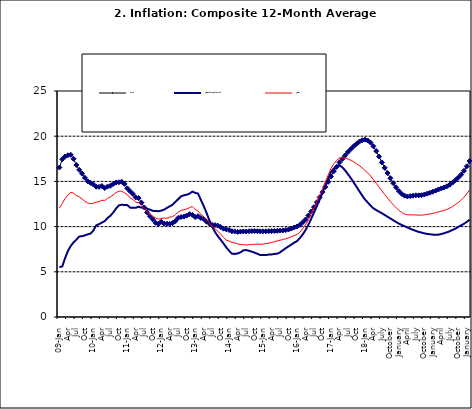
| Category | Food | All Items less Farm Produce | All Items |
|---|---|---|---|
| 09-Jan | 16.536 | 5.519 | 12.032 |
| Feb | 17.454 | 5.591 | 12.567 |
| Mar | 17.742 | 6.51 | 13.101 |
| Apr | 17.89 | 7.302 | 13.51 |
| May | 17.949 | 7.847 | 13.787 |
| June | 17.498 | 8.259 | 13.694 |
| Jul | 16.808 | 8.554 | 13.437 |
| Aug | 16.278 | 8.906 | 13.307 |
| Sep | 15.859 | 8.942 | 13.065 |
| Oct | 15.396 | 9.024 | 12.803 |
| Nov | 15.018 | 9.143 | 12.609 |
| Dec | 14.841 | 9.226 | 12.538 |
| 10-Jan | 14.668 | 9.567 | 12.586 |
| Feb | 14.411 | 10.138 | 12.7 |
| Mar | 14.395 | 10.269 | 12.757 |
| Apr | 14.489 | 10.444 | 12.915 |
| May | 14.266 | 10.597 | 12.893 |
| Jun | 14.424 | 10.948 | 13.132 |
| Jul | 14.514 | 11.193 | 13.284 |
| Aug | 14.706 | 11.549 | 13.5 |
| Sep | 14.872 | 11.997 | 13.764 |
| Oct | 14.906 | 12.345 | 13.908 |
| Nov | 14.967 | 12.423 | 13.928 |
| Dec | 14.723 | 12.383 | 13.74 |
| 11-Jan | 14.233 | 12.385 | 13.542 |
| Feb | 13.903 | 12.099 | 13.161 |
| Mar | 13.606 | 12.077 | 13.001 |
| Apr | 13.227 | 12.088 | 12.694 |
| May | 13.152 | 12.198 | 12.648 |
| Jun | 12.654 | 12.1 | 12.321 |
| Jul | 12.118 | 12.109 | 12.009 |
| Aug | 11.575 | 11.98 | 11.635 |
| Sep | 11.155 | 11.877 | 11.363 |
| Oct | 10.797 | 11.746 | 11.13 |
| Nov | 10.422 | 11.721 | 10.952 |
| Dec | 10.298 | 11.706 | 10.826 |
| 12-Jan | 10.538 | 11.765 | 10.886 |
| 12-Feb | 10.336 | 11.872 | 10.955 |
| 12-Mar | 10.325 | 12.075 | 10.914 |
| Apr | 10.304 | 12.242 | 11.054 |
| May | 10.387 | 12.419 | 11.096 |
| Jun | 10.617 | 12.732 | 11.32 |
| Jul | 10.963 | 13.032 | 11.599 |
| Aug | 11.056 | 13.349 | 11.791 |
| Sep | 11.104 | 13.467 | 11.859 |
| Oct | 11.216 | 13.525 | 11.948 |
| Nov | 11.372 | 13.649 | 12.091 |
| Dec | 11.296 | 13.873 | 12.224 |
| 13-Jan | 11.055 | 13.737 | 11.908 |
| Feb | 11.153 | 13.657 | 11.703 |
| Mar | 10.951 | 12.963 | 11.394 |
| Apr | 10.844 | 12.281 | 11.072 |
| May | 10.548 | 11.531 | 10.761 |
| Jun | 10.352 | 10.704 | 10.383 |
| Jul | 10.186 | 10.005 | 10.047 |
| Aug | 10.168 | 9.4 | 9.761 |
| Sep | 10.105 | 8.939 | 9.486 |
| Oct | 9.955 | 8.553 | 9.167 |
| Nov | 9.774 | 8.136 | 8.815 |
| Dec | 9.695 | 7.691 | 8.496 |
| 14-Jan | 9.626 | 7.317 | 8.408 |
| Feb | 9.484 | 7.005 | 8.257 |
| Mar | 9.464 | 6.976 | 8.19 |
| Apr | 9.416 | 7.03 | 8.092 |
| May | 9.448 | 7.151 | 8.012 |
| Jun | 9.464 | 7.369 | 7.998 |
| Jul | 9.459 | 7.411 | 7.968 |
| Aug | 9.481 | 7.325 | 7.996 |
| Sep | 9.501 | 7.228 | 8.027 |
| Oct | 9.508 | 7.116 | 8.047 |
| Nov | 9.492 | 6.991 | 8.046 |
| Dec | 9.481 | 6.854 | 8.047 |
| 15-Jan | 9.475 | 6.865 | 8.063 |
| Feb | 9.486 | 6.852 | 8.117 |
| Mar | 9.495 | 6.905 | 8.176 |
| Apr | 9.501 | 6.922 | 8.243 |
| May | 9.51 | 6.975 | 8.331 |
| Jun | 9.535 | 7.006 | 8.417 |
| Jul | 9.552 | 7.154 | 8.497 |
| Aug | 9.571 | 7.384 | 8.566 |
| Sep | 9.614 | 7.605 | 8.658 |
| Oct | 9.68 | 7.812 | 8.76 |
| Nov | 9.778 | 8.016 | 8.879 |
| Dec | 9.898 | 8.222 | 9.009 |
| 16-Jan | 10.017 | 8.391 | 9.13 |
| Feb | 10.184 | 8.732 | 9.386 |
| Mar | 10.471 | 9.132 | 9.751 |
| Apr | 10.786 | 9.614 | 10.182 |
| May | 11.221 | 10.196 | 10.746 |
| Jun | 11.672 | 10.864 | 11.372 |
| Jul | 12.162 | 11.553 | 12.045 |
| Aug | 12.696 | 12.247 | 12.744 |
| Sep | 13.238 | 12.98 | 13.454 |
| Oct | 13.817 | 13.757 | 14.206 |
| Nov | 14.386 | 14.542 | 14.958 |
| Dec | 14.946 | 15.307 | 15.697 |
| 17-Jan | 15.536 | 16.042 | 16.441 |
| Feb | 16.127 | 16.436 | 16.958 |
| Mar | 16.598 | 16.682 | 17.315 |
| Apr | 17.106 | 16.772 | 17.591 |
| May | 17.477 | 16.567 | 17.628 |
| Jun | 17.868 | 16.219 | 17.578 |
| Jul | 18.247 | 15.798 | 17.475 |
| Aug | 18.569 | 15.372 | 17.331 |
| Sep | 18.876 | 14.903 | 17.17 |
| Oct | 19.14 | 14.415 | 16.968 |
| Nov | 19.392 | 13.93 | 16.76 |
| Dec | 19.546 | 13.458 | 16.502 |
| 18-Jan | 19.621 | 13.01 | 16.215 |
| Feb | 19.521 | 12.668 | 15.93 |
| Mar | 19.294 | 12.33 | 15.599 |
| Apr | 18.886 | 12.021 | 15.196 |
| May | 18.359 | 11.828 | 14.793 |
| June | 17.745 | 11.651 | 14.371 |
| July | 17.102 | 11.478 | 13.95 |
| August | 16.501 | 11.285 | 13.546 |
| September | 15.923 | 11.092 | 13.157 |
| October | 15.355 | 10.903 | 12.777 |
| November | 14.802 | 10.703 | 12.406 |
| December | 14.348 | 10.514 | 12.095 |
| January | 13.934 | 10.339 | 11.801 |
| February | 13.62 | 10.185 | 11.564 |
| March | 13.42 | 10.044 | 11.401 |
| April | 13.339 | 9.909 | 11.314 |
| May | 13.371 | 9.77 | 11.299 |
| June | 13.418 | 9.64 | 11.297 |
| July | 13.46 | 9.524 | 11.291 |
| August | 13.458 | 9.411 | 11.271 |
| September | 13.474 | 9.337 | 11.268 |
| October | 13.544 | 9.253 | 11.298 |
| November | 13.646 | 9.189 | 11.348 |
| December | 13.743 | 9.155 | 11.396 |
| January | 13.859 | 9.112 | 11.462 |
| February | 13.98 | 9.086 | 11.539 |
| March | 14.109 | 9.112 | 11.624 |
| April | 14.221 | 9.174 | 11.706 |
| May | 14.325 | 9.267 | 11.791 |
| June | 14.46 | 9.375 | 11.904 |
| July | 14.634 | 9.484 | 12.049 |
| August | 14.869 | 9.638 | 12.233 |
| September | 15.135 | 9.775 | 12.44 |
| October | 15.416 | 9.965 | 12.664 |
| November | 15.746 | 10.136 | 12.923 |
| December | 16.169 | 10.308 | 13.246 |
| January | 16.662 | 10.519 | 13.616 |
| February | 17.251 | 10.767 | 14.053 |